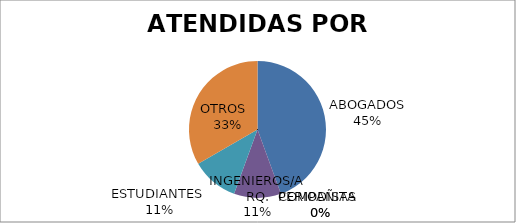
| Category | Series 0 |
|---|---|
| ABOGADOS | 4 |
| PERIODISTA  | 0 |
| COMPAÑIAS  | 0 |
| INGENIEROS/ARQ. | 1 |
| ESTUDIANTES  | 1 |
| OTROS   | 3 |